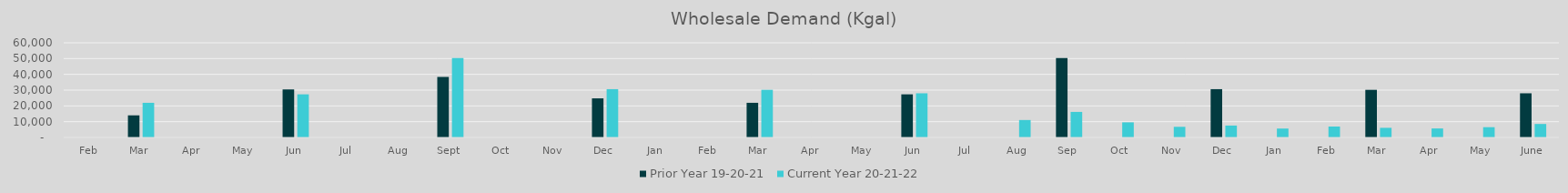
| Category | Prior Year 19-20-21 | Current Year 20-21-22 |
|---|---|---|
| Feb | 0 | 0 |
| Mar | 14013.78 | 21965.02 |
| Apr | 0 | 0 |
| May | 0 | 0 |
| Jun | 30443.6 | 27331 |
| Jul | 0 | 0 |
| Aug | 0 | 0 |
| Sep | 38376.14 | 50400.24 |
| Oct | 0 | 0 |
| Nov | 0 | 0 |
| Dec | 24784.98 | 30611.9 |
| Jan | 0 | 0 |
| Feb | 0 | 0 |
| Mar | 21965.02 | 30196.76 |
| Apr | 0 | 0 |
| May | 0 | 0 |
| Jun | 27331 | 27993.9 |
| Jul | 0 | 0 |
| Aug | 0 | 11056.179 |
| Sep | 50400.24 | 16202.763 |
| Oct | 0 | 9585.62 |
| Nov | 0 | 6754.44 |
| Dec | 30611.9 | 7547.32 |
| Jan | 0 | 5643.66 |
| Feb | 0 | 6907.78 |
| Mar | 30196.76 | 6111.16 |
| Apr | 0 | 5707.24 |
| May | 0 | 6522.56 |
| June | 27993.9 | 8549.64 |